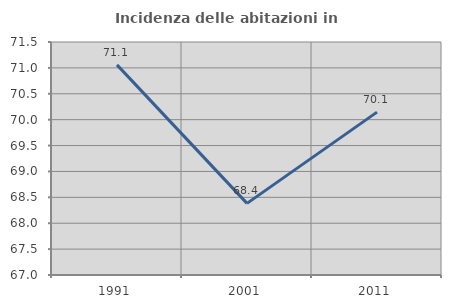
| Category | Incidenza delle abitazioni in proprietà  |
|---|---|
| 1991.0 | 71.058 |
| 2001.0 | 68.383 |
| 2011.0 | 70.146 |